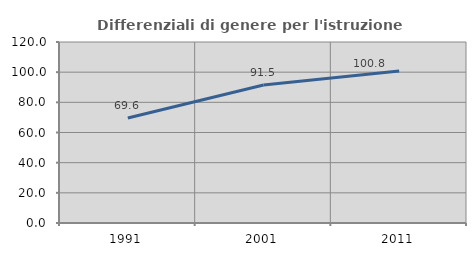
| Category | Differenziali di genere per l'istruzione superiore |
|---|---|
| 1991.0 | 69.588 |
| 2001.0 | 91.487 |
| 2011.0 | 100.844 |